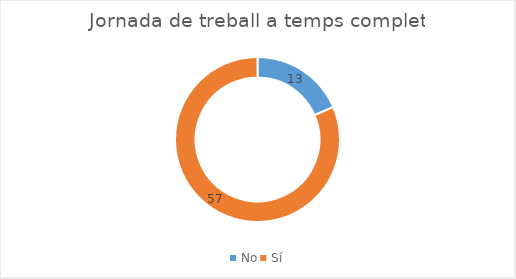
| Category | Series 0 |
|---|---|
| No | 13 |
| Sí | 57 |